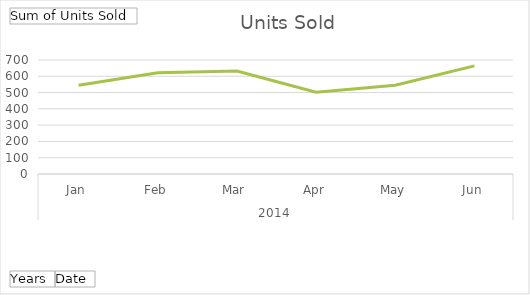
| Category | Total |
|---|---|
| 0 | 545 |
| 1 | 621 |
| 2 | 632 |
| 3 | 502 |
| 4 | 545 |
| 5 | 664 |